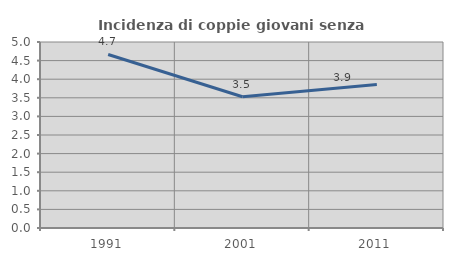
| Category | Incidenza di coppie giovani senza figli |
|---|---|
| 1991.0 | 4.665 |
| 2001.0 | 3.529 |
| 2011.0 | 3.858 |